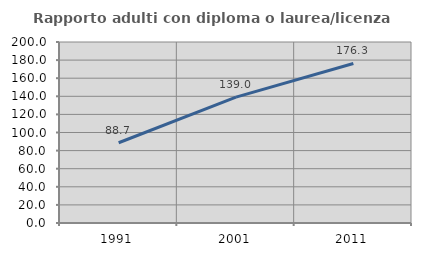
| Category | Rapporto adulti con diploma o laurea/licenza media  |
|---|---|
| 1991.0 | 88.652 |
| 2001.0 | 139.024 |
| 2011.0 | 176.301 |